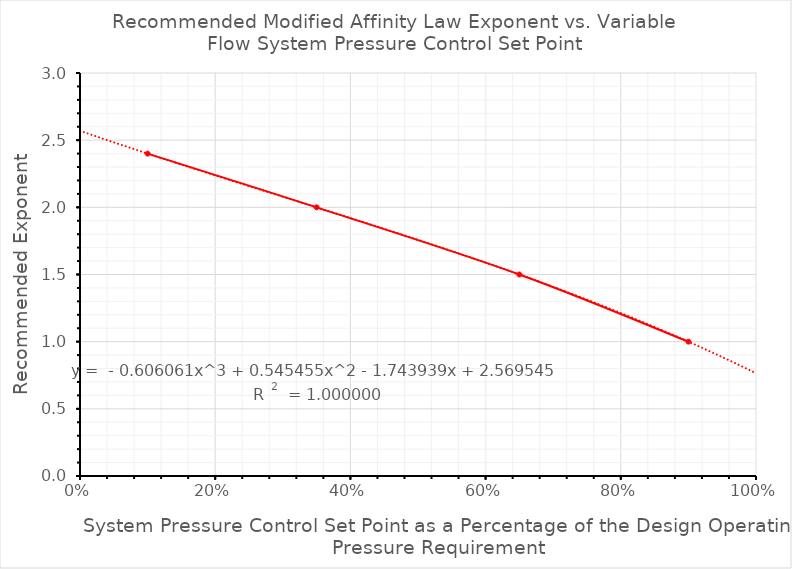
| Category | Recommended Exponent |
|---|---|
| 0.1 | 2.4 |
| 0.35 | 2 |
| 0.65 | 1.5 |
| 0.9 | 1 |